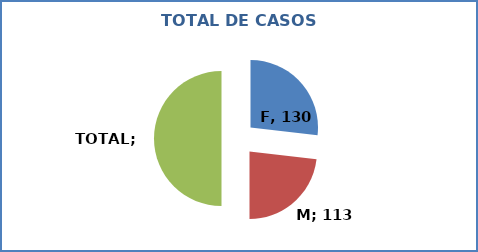
| Category | Series 0 |
|---|---|
| F | 130 |
| M | 112 |
| TOTAL | 242 |